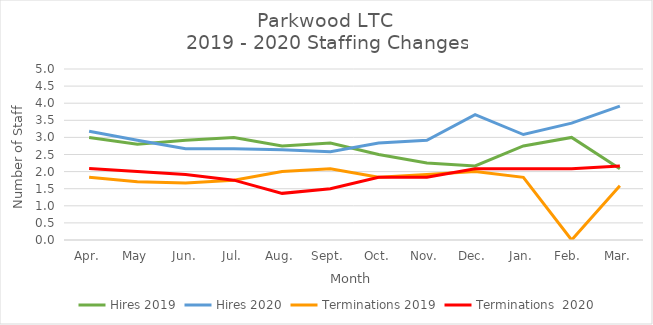
| Category | Hires 2019 | Hires 2020 | Terminations 2019 | Terminations  2020 |
|---|---|---|---|---|
| Apr. | 3 | 3.182 | 1.833 | 2.091 |
| May | 2.8 | 2.917 | 1.7 | 2 |
| Jun. | 2.917 | 2.667 | 1.667 | 1.917 |
| Jul. | 3 | 2.667 | 1.75 | 1.75 |
| Aug. | 2.75 | 2.636 | 2 | 1.364 |
| Sept. | 2.833 | 2.583 | 2.083 | 1.5 |
| Oct. | 2.5 | 2.833 | 1.833 | 1.833 |
| Nov. | 2.25 | 2.917 | 1.917 | 1.833 |
| Dec. | 2.167 | 3.667 | 2 | 2.083 |
| Jan. | 2.75 | 3.083 | 1.833 | 2.083 |
| Feb.  | 3 | 3.417 | 0 | 2.083 |
| Mar. | 2.083 | 3.917 | 1.583 | 2.167 |